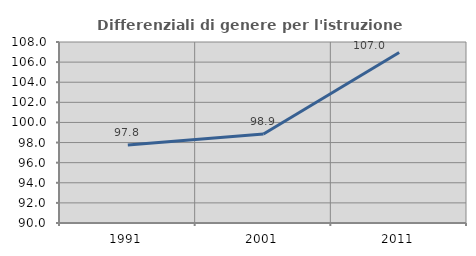
| Category | Differenziali di genere per l'istruzione superiore |
|---|---|
| 1991.0 | 97.761 |
| 2001.0 | 98.851 |
| 2011.0 | 106.965 |